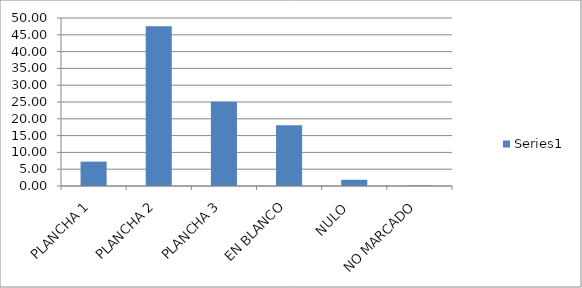
| Category | Series 0 |
|---|---|
| PLANCHA 1 | 7.259 |
| PLANCHA 2 | 47.519 |
| PLANCHA 3 | 25.111 |
| EN BLANCO | 18.111 |
| NULO  | 1.852 |
| NO MARCADO | 0.148 |